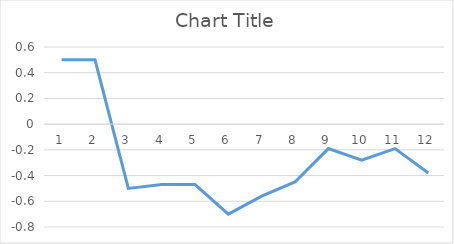
| Category | Series 0 |
|---|---|
| 0 | 0.5 |
| 1 | 0.5 |
| 2 | -0.5 |
| 3 | -0.47 |
| 4 | -0.47 |
| 5 | -0.7 |
| 6 | -0.56 |
| 7 | -0.45 |
| 8 | -0.19 |
| 9 | -0.28 |
| 10 | -0.19 |
| 11 | -0.38 |